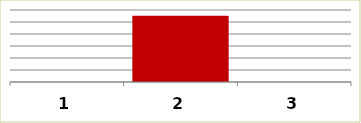
| Category | Series 0 |
|---|---|
| 0 | 0 |
| 1 | 1104594 |
| 2 | 0 |